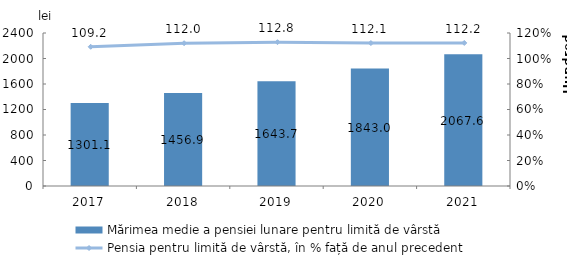
| Category | Mărimea medie a pensiei lunare pentru limită de vârstă |
|---|---|
| 2017.0 | 1301.14 |
| 2018.0 | 1456.9 |
| 2019.0 | 1643.7 |
| 2020.0 | 1843 |
| 2021.0 | 2067.6 |